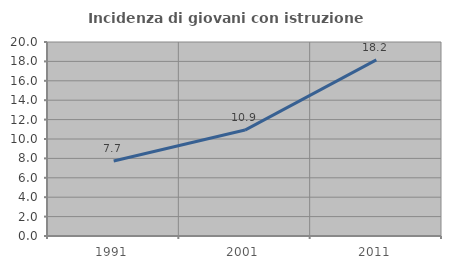
| Category | Incidenza di giovani con istruzione universitaria |
|---|---|
| 1991.0 | 7.725 |
| 2001.0 | 10.921 |
| 2011.0 | 18.159 |